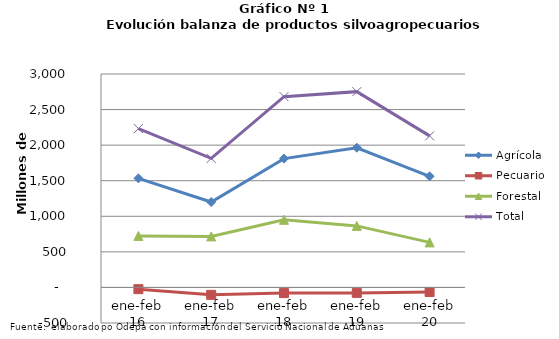
| Category | Agrícola | Pecuario | Forestal | Total |
|---|---|---|---|---|
| ene-feb 16 | 1532979 | -24127 | 724001 | 2232853 |
| ene-feb 17 | 1200308 | -104012 | 717594 | 1813890 |
| ene-feb 18 | 1810843 | -79687 | 950255 | 2681411 |
| ene-feb 19 | 1963636 | -76652 | 864930 | 2751914 |
| ene-feb 20 | 1561454 | -64226 | 632881 | 2130109 |